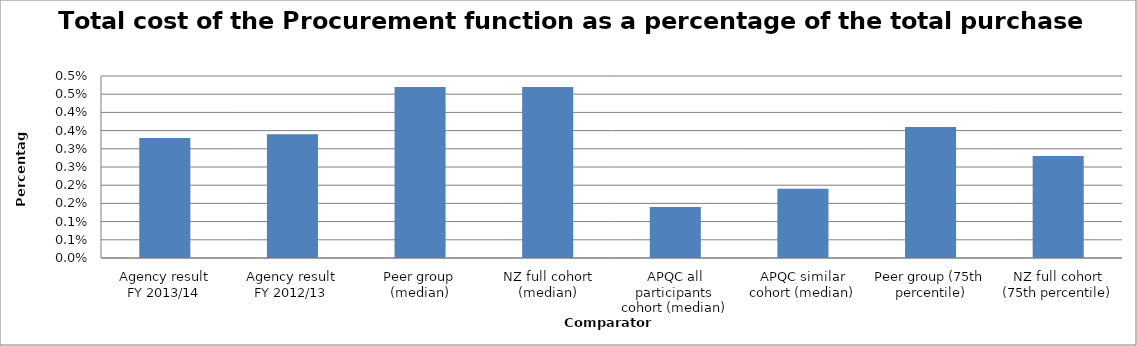
| Category | Result |
|---|---|
| Agency result
FY 2013/14 | 0.003 |
| Agency result
FY 2012/13 | 0.003 |
| Peer group (median) | 0.005 |
| NZ full cohort (median) | 0.005 |
| APQC all participants cohort (median) | 0.001 |
| APQC similar cohort (median) | 0.002 |
| Peer group (75th percentile) | 0.004 |
| NZ full cohort (75th percentile) | 0.003 |